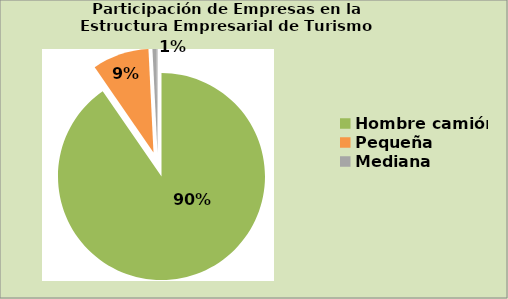
| Category | Series 0 |
|---|---|
| Hombre camión | 90.384 |
| Pequeña | 8.836 |
| Mediana | 0.618 |
| Grande | 0.162 |